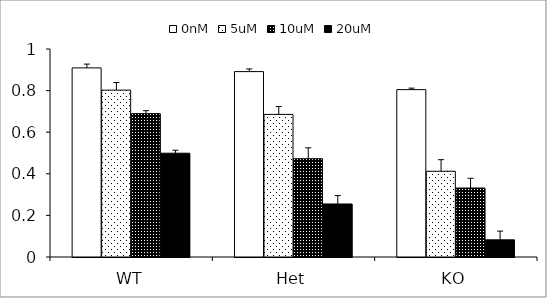
| Category | 0nM | 5uM | 10uM | 20uM |
|---|---|---|---|---|
| WT | 0.909 | 0.802 | 0.689 | 0.499 |
| Het | 0.891 | 0.686 | 0.472 | 0.255 |
| KO | 0.805 | 0.412 | 0.332 | 0.083 |